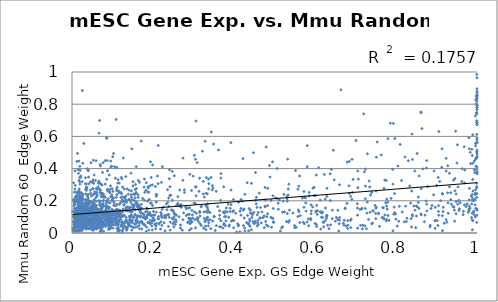
| Category | Series 0 |
|---|---|
| 0.718357 | 0.048 |
| 0.285556 | 0.115 |
| 0.155029 | 0.054 |
| 0.94191 | 0.328 |
| 0.474218 | 0.106 |
| 0.679518 | 0.44 |
| 0.994989 | 0.21 |
| 0.901487 | 0.076 |
| 0.110698 | 0.238 |
| 0.07789 | 0.042 |
| 0.333953 | 0.096 |
| 0.0120055 | 0.233 |
| 0.0165022 | 0.205 |
| 0.683924 | 0.293 |
| 0.888867 | 0.171 |
| 0.269317 | 0.176 |
| 0.150832 | 0.155 |
| 0.521332 | 0.199 |
| 0.196581 | 0.107 |
| 0.75157 | 0.159 |
| 0.637877 | 0.201 |
| 0.175998 | 0.095 |
| 0.660283 | 0.08 |
| 0.0950655 | 0.293 |
| 0.988347 | 0.24 |
| 0.483557 | 0.278 |
| 0.861981 | 0.118 |
| 0.060758 | 0.025 |
| 0.514572 | 0.012 |
| 0.0789242 | 0.058 |
| 0.996859 | 0.153 |
| 0.282066 | 0.151 |
| 0.999918 | 0.797 |
| 0.848596 | 0.033 |
| 0.0527951 | 0.152 |
| 0.337095 | 0.334 |
| 0.143686 | 0.104 |
| 0.144068 | 0.069 |
| 0.199073 | 0.423 |
| 0.549527 | 0.046 |
| 0.212938 | 0.544 |
| 0.572661 | 0.258 |
| 0.201103 | 0.134 |
| 0.313554 | 0.259 |
| 0.0573692 | 0.159 |
| 0.0279317 | 0.163 |
| 0.529778 | 0.071 |
| 0.517628 | 0.031 |
| 0.432492 | 0.312 |
| 0.0153344 | 0.092 |
| 0.625758 | 0.156 |
| 0.531065 | 0.212 |
| 0.0605387 | 0.112 |
| 0.443017 | 0.02 |
| 0.0858762 | 0.1 |
| 0.0252657 | 0.042 |
| 0.0222175 | 0.064 |
| 0.0837457 | 0.162 |
| 0.414497 | 0.008 |
| 0.423444 | 0.046 |
| 0.96833 | 0.536 |
| 0.0822502 | 0.304 |
| 0.09217 | 0.255 |
| 0.141815 | 0.155 |
| 0.234822 | 0.144 |
| 0.11498 | 0.261 |
| 0.141614 | 0.104 |
| 0.0581019 | 0.327 |
| 0.133703 | 0.161 |
| 0.0196944 | 0.038 |
| 0.0957484 | 0.447 |
| 0.0468442 | 0.085 |
| 0.0160687 | 0.041 |
| 0.0659149 | 0.059 |
| 0.181001 | 0.087 |
| 0.0706342 | 0.149 |
| 0.0345382 | 0.112 |
| 0.114906 | 0.055 |
| 0.155152 | 0.24 |
| 0.0438015 | 0.085 |
| 0.158073 | 0.246 |
| 0.0207399 | 0.071 |
| 0.109202 | 0.145 |
| 0.114537 | 0.064 |
| 0.0153444 | 0.142 |
| 0.117055 | 0.081 |
| 0.0210749 | 0.226 |
| 0.120328 | 0.189 |
| 0.343898 | 0.628 |
| 0.0160836 | 0.079 |
| 0.00742404 | 0.055 |
| 0.0233189 | 0.056 |
| 0.0383991 | 0.133 |
| 0.0199004 | 0.14 |
| 0.417271 | 0.152 |
| 0.232929 | 0.18 |
| 0.173498 | 0.059 |
| 0.0481266 | 0.065 |
| 0.116635 | 0.311 |
| 0.786092 | 0.681 |
| 0.0465272 | 0.152 |
| 0.27743 | 0.268 |
| 0.0352039 | 0.025 |
| 0.0249195 | 0.016 |
| 0.325787 | 0.13 |
| 0.951757 | 0.548 |
| 0.676875 | 0.044 |
| 0.0191285 | 0.344 |
| 0.0322849 | 0.055 |
| 0.289801 | 0.018 |
| 0.319936 | 0.167 |
| 0.0190005 | 0.095 |
| 0.236062 | 0.269 |
| 0.168207 | 0.128 |
| 0.0260575 | 0.025 |
| 0.6003 | 0.059 |
| 0.130739 | 0.215 |
| 0.314993 | 0.34 |
| 0.536633 | 0.077 |
| 0.568685 | 0.216 |
| 0.0700549 | 0.265 |
| 0.0309574 | 0.033 |
| 0.0722578 | 0.046 |
| 0.0693182 | 0.063 |
| 0.0136864 | 0.198 |
| 0.0696079 | 0.013 |
| 0.0482181 | 0.024 |
| 0.0118453 | 0.445 |
| 0.152051 | 0.163 |
| 0.167323 | 0.14 |
| 0.726782 | 0.027 |
| 0.0376793 | 0.173 |
| 0.0372241 | 0.044 |
| 0.493965 | 0.093 |
| 0.399084 | 0.033 |
| 0.145627 | 0.136 |
| 0.704594 | 0.182 |
| 0.840585 | 0.457 |
| 0.335006 | 0.148 |
| 0.0843456 | 0.084 |
| 0.604038 | 0.172 |
| 0.312608 | 0.07 |
| 0.0368721 | 0.054 |
| 0.681427 | 0.048 |
| 0.0508171 | 0.146 |
| 0.602584 | 0.137 |
| 0.0850064 | 0.133 |
| 0.705829 | 0.281 |
| 0.57118 | 0.067 |
| 0.808306 | 0.166 |
| 0.0705671 | 0.054 |
| 0.0232542 | 0.023 |
| 0.705768 | 0.385 |
| 0.597916 | 0.283 |
| 0.733568 | 0.323 |
| 0.53548 | 0.303 |
| 0.0891933 | 0.113 |
| 0.223292 | 0.098 |
| 0.580521 | 0.069 |
| 0.550494 | 0.033 |
| 0.0181383 | 0.191 |
| 0.315555 | 0.128 |
| 0.0463404 | 0.093 |
| 0.803249 | 0.043 |
| 0.0466587 | 0.071 |
| 0.364445 | 0.11 |
| 0.680432 | 0.028 |
| 0.116857 | 0.074 |
| 0.100539 | 0.125 |
| 0.128543 | 0.177 |
| 0.022665 | 0.103 |
| 0.012778 | 0.195 |
| 0.0418495 | 0.305 |
| 0.0871548 | 0.45 |
| 0.0176795 | 0.037 |
| 0.0101371 | 0.148 |
| 0.0856256 | 0.334 |
| 0.187494 | 0.113 |
| 0.0681547 | 0.099 |
| 0.0124649 | 0.114 |
| 0.969517 | 0.311 |
| 0.113535 | 0.11 |
| 0.0681806 | 0.699 |
| 0.178704 | 0.053 |
| 0.748192 | 0.172 |
| 0.0525424 | 0.031 |
| 0.0702964 | 0.416 |
| 0.422176 | 0.462 |
| 0.018036 | 0.099 |
| 0.0679802 | 0.131 |
| 0.101214 | 0.03 |
| 0.0896006 | 0.213 |
| 0.0225988 | 0.071 |
| 0.111407 | 0.101 |
| 0.0147012 | 0.065 |
| 0.0400479 | 0.39 |
| 0.0742723 | 0.062 |
| 0.0187522 | 0.064 |
| 0.139893 | 0.044 |
| 0.0211039 | 0.203 |
| 0.110488 | 0.069 |
| 0.094565 | 0.073 |
| 0.10492 | 0.081 |
| 0.0383495 | 0.147 |
| 0.0439104 | 0.105 |
| 0.0262996 | 0.091 |
| 0.0108756 | 0.194 |
| 0.105053 | 0.127 |
| 0.12918 | 0.11 |
| 0.0358865 | 0.043 |
| 0.033009 | 0.19 |
| 0.0545646 | 0.082 |
| 0.125645 | 0.108 |
| 0.0913621 | 0.032 |
| 0.197229 | 0.063 |
| 0.0856379 | 0.051 |
| 0.0629213 | 0.055 |
| 0.0462658 | 0.137 |
| 0.0591831 | 0.028 |
| 0.0870486 | 0.088 |
| 0.55784 | 0.102 |
| 0.198433 | 0.299 |
| 0.221934 | 0.047 |
| 0.120658 | 0.042 |
| 0.0503294 | 0.054 |
| 0.0932733 | 0.114 |
| 0.150976 | 0.161 |
| 0.166281 | 0.064 |
| 0.125929 | 0.039 |
| 0.161572 | 0.039 |
| 0.126058 | 0.024 |
| 0.0274446 | 0.117 |
| 0.0924494 | 0.125 |
| 0.411243 | 0.049 |
| 0.197301 | 0.043 |
| 0.439124 | 0.074 |
| 0.0700726 | 0.199 |
| 0.273901 | 0.327 |
| 0.30215 | 0.483 |
| 0.274168 | 0.465 |
| 0.166722 | 0.315 |
| 0.53701 | 0.142 |
| 0.923946 | 0.463 |
| 0.0377976 | 0.15 |
| 0.0284928 | 0.032 |
| 0.776772 | 0.167 |
| 0.174409 | 0.214 |
| 0.82044 | 0.069 |
| 0.0521454 | 0.056 |
| 0.167081 | 0.026 |
| 0.775905 | 0.075 |
| 0.113391 | 0.07 |
| 0.0213719 | 0.024 |
| 0.0993862 | 0.139 |
| 0.156346 | 0.144 |
| 0.999163 | 0.281 |
| 0.238074 | 0.041 |
| 0.398602 | 0.208 |
| 0.638395 | 0.051 |
| 0.825694 | 0.072 |
| 0.999379 | 0.066 |
| 0.670074 | 0.06 |
| 0.981042 | 0.166 |
| 0.480978 | 0.101 |
| 0.99989 | 0.766 |
| 0.43532 | 0.06 |
| 0.988663 | 0.218 |
| 0.193111 | 0.08 |
| 0.72301 | 0.044 |
| 0.855196 | 0.19 |
| 0.90352 | 0.047 |
| 0.756341 | 0.12 |
| 0.684908 | 0.246 |
| 0.973003 | 0.164 |
| 0.989307 | 0.333 |
| 0.585557 | 0.252 |
| 0.980014 | 0.149 |
| 0.038201 | 0.093 |
| 0.0584004 | 0.093 |
| 0.594336 | 0.162 |
| 0.133495 | 0.154 |
| 0.0330171 | 0.064 |
| 0.614403 | 0.129 |
| 0.138823 | 0.242 |
| 0.0905877 | 0.112 |
| 0.177713 | 0.104 |
| 0.857122 | 0.354 |
| 0.072196 | 0.239 |
| 0.330093 | 0.173 |
| 0.128755 | 0.194 |
| 0.0522356 | 0.049 |
| 0.0584545 | 0.249 |
| 0.457057 | 0.043 |
| 0.621135 | 0.065 |
| 0.124454 | 0.103 |
| 0.850452 | 0.105 |
| 0.18346 | 0.312 |
| 0.714606 | 0.148 |
| 0.137326 | 0.162 |
| 0.804975 | 0.416 |
| 0.506313 | 0.4 |
| 0.687748 | 0.079 |
| 0.574095 | 0.222 |
| 0.69102 | 0.209 |
| 0.309129 | 0.095 |
| 0.334107 | 0.243 |
| 0.0292313 | 0.151 |
| 0.111092 | 0.057 |
| 0.904274 | 0.345 |
| 0.292391 | 0.06 |
| 0.337602 | 0.064 |
| 0.272274 | 0.017 |
| 0.583426 | 0.088 |
| 0.71246 | 0.047 |
| 0.0591122 | 0.061 |
| 0.166717 | 0.162 |
| 0.962411 | 0.32 |
| 0.928381 | 0.187 |
| 0.425002 | 0.149 |
| 0.945716 | 0.262 |
| 0.142605 | 0.093 |
| 0.22847 | 0.108 |
| 0.0458777 | 0.194 |
| 0.297629 | 0.093 |
| 0.22016 | 0.109 |
| 0.98841 | 0.123 |
| 0.778189 | 0.148 |
| 0.387912 | 0.042 |
| 0.838799 | 0.261 |
| 0.390629 | 0.154 |
| 0.107161 | 0.11 |
| 0.242008 | 0.287 |
| 0.0221483 | 0.038 |
| 0.659693 | 0.057 |
| 0.190363 | 0.118 |
| 0.602073 | 0.13 |
| 0.337894 | 0.307 |
| 0.42534 | 0.093 |
| 0.165226 | 0.174 |
| 0.0149119 | 0.164 |
| 0.107183 | 0.062 |
| 0.336688 | 0.08 |
| 0.0666712 | 0.037 |
| 0.0319926 | 0.056 |
| 0.0930773 | 0.251 |
| 0.164657 | 0.146 |
| 0.0511316 | 0.086 |
| 0.0635012 | 0.057 |
| 0.019651 | 0.148 |
| 0.0574801 | 0.041 |
| 0.056643 | 0.077 |
| 0.0182736 | 0.106 |
| 0.426997 | 0.013 |
| 0.0480423 | 0.077 |
| 0.0317637 | 0.033 |
| 0.090616 | 0.152 |
| 0.874517 | 0.199 |
| 0.749595 | 0.122 |
| 0.152994 | 0.163 |
| 0.422767 | 0.142 |
| 0.109243 | 0.115 |
| 0.20055 | 0.09 |
| 0.124092 | 0.053 |
| 0.15244 | 0.099 |
| 0.390682 | 0.134 |
| 0.0553856 | 0.023 |
| 0.287095 | 0.155 |
| 0.148458 | 0.066 |
| 0.150987 | 0.094 |
| 0.0642308 | 0.085 |
| 0.0724478 | 0.023 |
| 0.0370698 | 0.163 |
| 0.0235357 | 0.056 |
| 0.0600038 | 0.084 |
| 0.0422625 | 0.188 |
| 0.00875941 | 0.09 |
| 0.0202835 | 0.187 |
| 0.0922949 | 0.076 |
| 0.0258915 | 0.073 |
| 0.0621678 | 0.103 |
| 0.0187486 | 0.319 |
| 0.0434104 | 0.068 |
| 0.0290432 | 0.556 |
| 0.0219038 | 0.065 |
| 0.0298475 | 0.098 |
| 0.0185486 | 0.097 |
| 0.0155305 | 0.095 |
| 0.00836883 | 0.096 |
| 0.178905 | 0.335 |
| 0.0350686 | 0.113 |
| 0.00313033 | 0.013 |
| 0.409005 | 0.057 |
| 0.99999 | 0.781 |
| 0.705156 | 0.03 |
| 0.642772 | 0.089 |
| 0.189449 | 0.116 |
| 0.948458 | 0.195 |
| 0.0229426 | 0.031 |
| 0.107544 | 0.142 |
| 0.496988 | 0.152 |
| 0.0654882 | 0.108 |
| 0.128297 | 0.057 |
| 1.0 | 0.492 |
| 0.113653 | 0.119 |
| 0.995609 | 0.099 |
| 0.0475176 | 0.071 |
| 1.0 | 0.506 |
| 0.172926 | 0.067 |
| 0.0987624 | 0.097 |
| 0.0193539 | 0.102 |
| 0.160225 | 0.1 |
| 0.0809594 | 0.103 |
| 0.004848 | 0.054 |
| 0.0260537 | 0.116 |
| 0.188661 | 0.066 |
| 0.0532216 | 0.308 |
| 0.00544776 | 0.128 |
| 0.065879 | 0.201 |
| 0.291099 | 0.364 |
| 0.00724447 | 0.196 |
| 0.0328903 | 0.106 |
| 0.013506 | 0.049 |
| 0.117464 | 0.016 |
| 0.024043 | 0.186 |
| 0.0251224 | 0.227 |
| 0.0160722 | 0.12 |
| 0.0923221 | 0.063 |
| 0.0330893 | 0.306 |
| 0.0235889 | 0.128 |
| 0.0373617 | 0.101 |
| 0.0226899 | 0.072 |
| 0.928856 | 0.123 |
| 0.0605936 | 0.171 |
| 0.0175206 | 0.15 |
| 0.100987 | 0.212 |
| 0.989866 | 0.076 |
| 0.117422 | 0.179 |
| 0.0776009 | 0.166 |
| 0.207924 | 0.228 |
| 0.492768 | 0.036 |
| 0.201311 | 0.08 |
| 0.0220259 | 0.354 |
| 0.15999 | 0.094 |
| 0.0371947 | 0.057 |
| 0.0548928 | 0.066 |
| 0.0299016 | 0.06 |
| 0.00728444 | 0.104 |
| 0.28061 | 0.161 |
| 0.10746 | 0.096 |
| 0.321984 | 0.508 |
| 0.0480868 | 0.156 |
| 0.163812 | 0.146 |
| 0.0691385 | 0.252 |
| 0.381183 | 0.156 |
| 0.168098 | 0.099 |
| 0.137462 | 0.059 |
| 0.15816 | 0.079 |
| 0.121029 | 0.134 |
| 0.0926403 | 0.072 |
| 0.0263363 | 0.238 |
| 0.0719615 | 0.302 |
| 0.108238 | 0.169 |
| 0.198015 | 0.074 |
| 0.111261 | 0.079 |
| 0.0616088 | 0.111 |
| 0.0337606 | 0.111 |
| 0.0279446 | 0.122 |
| 0.0318437 | 0.087 |
| 0.0184565 | 0.072 |
| 0.0164582 | 0.178 |
| 0.0118417 | 0.095 |
| 0.0699236 | 0.065 |
| 0.0675765 | 0.102 |
| 0.073409 | 0.144 |
| 0.0393377 | 0.171 |
| 0.0840835 | 0.186 |
| 0.0363018 | 0.078 |
| 0.0707856 | 0.12 |
| 0.0822908 | 0.14 |
| 0.041819 | 0.113 |
| 0.230094 | 0.095 |
| 0.0370766 | 0.132 |
| 0.0922987 | 0.122 |
| 0.035196 | 0.182 |
| 0.0373944 | 0.4 |
| 0.0368484 | 0.057 |
| 0.84401 | 0.168 |
| 0.0398237 | 0.149 |
| 0.968893 | 0.175 |
| 0.0921424 | 0.132 |
| 0.742144 | 0.061 |
| 0.996684 | 0.556 |
| 0.0546568 | 0.115 |
| 0.871583 | 0.111 |
| 0.157416 | 0.079 |
| 0.207528 | 0.043 |
| 0.0639192 | 0.12 |
| 0.252708 | 0.355 |
| 0.979956 | 0.591 |
| 0.855279 | 0.223 |
| 0.0570127 | 0.096 |
| 0.00614132 | 0.079 |
| 0.0956843 | 0.113 |
| 0.0189712 | 0.124 |
| 0.0120591 | 0.017 |
| 0.0452104 | 0.083 |
| 0.135016 | 0.017 |
| 0.121112 | 0.252 |
| 0.158357 | 0.252 |
| 0.153035 | 0.203 |
| 0.0337317 | 0.104 |
| 0.0230631 | 0.026 |
| 0.0618924 | 0.091 |
| 0.186018 | 0.149 |
| 0.00887429 | 0.117 |
| 0.0290007 | 0.088 |
| 0.074817 | 0.112 |
| 0.0402795 | 0.24 |
| 0.132847 | 0.35 |
| 0.206804 | 0.026 |
| 0.00645589 | 0.031 |
| 0.020534 | 0.091 |
| 0.0134809 | 0.494 |
| 0.0363262 | 0.072 |
| 0.0134591 | 0.253 |
| 0.0517626 | 0.316 |
| 0.0980891 | 0.113 |
| 0.0558845 | 0.256 |
| 0.0380486 | 0.159 |
| 0.177892 | 0.285 |
| 0.0175424 | 0.075 |
| 0.00980263 | 0.094 |
| 0.0236384 | 0.131 |
| 0.00397577 | 0.073 |
| 0.0061991 | 0.254 |
| 0.0088116 | 0.098 |
| 0.0106938 | 0.138 |
| 0.0336461 | 0.148 |
| 0.0384085 | 0.196 |
| 0.0110796 | 0.075 |
| 0.00576948 | 0.069 |
| 0.0611379 | 0.228 |
| 0.0506045 | 0.108 |
| 0.0719844 | 0.142 |
| 0.00523145 | 0.096 |
| 0.195928 | 0.186 |
| 0.0523021 | 0.164 |
| 0.0596102 | 0.029 |
| 0.0156793 | 0.192 |
| 0.277675 | 0.252 |
| 0.0288302 | 0.085 |
| 0.0270271 | 0.15 |
| 0.0978777 | 0.095 |
| 0.0683133 | 0.034 |
| 0.0459034 | 0.06 |
| 0.143415 | 0.134 |
| 0.0206203 | 0.057 |
| 0.0726655 | 0.054 |
| 0.040276 | 0.387 |
| 0.098396 | 0.148 |
| 0.367524 | 0.038 |
| 0.0108307 | 0.052 |
| 0.14672 | 0.262 |
| 0.036813 | 0.068 |
| 0.0747737 | 0.156 |
| 0.0196605 | 0.303 |
| 0.0236146 | 0.158 |
| 0.0179074 | 0.158 |
| 0.0399844 | 0.211 |
| 0.0804127 | 0.078 |
| 0.0656093 | 0.089 |
| 0.109357 | 0.063 |
| 0.0405566 | 0.132 |
| 0.0385126 | 0.184 |
| 0.054549 | 0.177 |
| 0.13465 | 0.19 |
| 0.124933 | 0.286 |
| 0.122376 | 0.243 |
| 0.43858 | 0.085 |
| 0.0901662 | 0.022 |
| 0.273947 | 0.082 |
| 0.701226 | 0.575 |
| 0.0623707 | 0.119 |
| 0.0131994 | 0.107 |
| 0.239013 | 0.166 |
| 0.0204833 | 0.115 |
| 0.105714 | 0.082 |
| 0.452602 | 0.073 |
| 0.836231 | 0.187 |
| 0.0226294 | 0.153 |
| 0.161074 | 0.078 |
| 0.305014 | 0.032 |
| 0.0387454 | 0.059 |
| 0.589547 | 0.083 |
| 0.379472 | 0.102 |
| 0.130212 | 0.043 |
| 0.737211 | 0.236 |
| 0.376612 | 0.101 |
| 0.185258 | 0.11 |
| 0.531661 | 0.121 |
| 0.141747 | 0.049 |
| 0.247636 | 0.382 |
| 0.0484678 | 0.164 |
| 0.0167652 | 0.13 |
| 0.00736248 | 0.107 |
| 0.0219418 | 0.224 |
| 0.0216522 | 0.346 |
| 0.107063 | 0.341 |
| 0.00753605 | 0.272 |
| 0.015198 | 0.393 |
| 0.0977996 | 0.051 |
| 0.0191938 | 0.09 |
| 0.0167608 | 0.139 |
| 0.0538776 | 0.241 |
| 0.0110527 | 0.067 |
| 0.0177158 | 0.082 |
| 0.0182761 | 0.104 |
| 0.0533476 | 0.12 |
| 0.0758922 | 0.065 |
| 0.0424399 | 0.115 |
| 0.0200409 | 0.168 |
| 0.0317875 | 0.085 |
| 0.0333483 | 0.343 |
| 0.00828313 | 0.295 |
| 0.0149492 | 0.109 |
| 0.0150583 | 0.053 |
| 0.173181 | 0.065 |
| 0.117179 | 0.112 |
| 0.0211326 | 0.145 |
| 0.0523996 | 0.056 |
| 0.0413371 | 0.028 |
| 0.0781463 | 0.203 |
| 0.0921525 | 0.063 |
| 0.0762764 | 0.133 |
| 0.255319 | 0.054 |
| 0.195667 | 0.109 |
| 0.0700316 | 0.133 |
| 0.0734983 | 0.152 |
| 0.443843 | 0.118 |
| 0.040067 | 0.219 |
| 0.0440704 | 0.091 |
| 0.417263 | 0.111 |
| 0.4396 | 0.042 |
| 0.0943499 | 0.091 |
| 0.0490169 | 0.063 |
| 0.242555 | 0.067 |
| 0.0724209 | 0.009 |
| 0.139368 | 0.061 |
| 0.0123547 | 0.061 |
| 0.0159963 | 0.37 |
| 0.0835936 | 0.111 |
| 0.435403 | 0.056 |
| 0.822004 | 0.472 |
| 0.0725491 | 0.089 |
| 0.00714861 | 0.176 |
| 0.625059 | 0.21 |
| 0.806792 | 0.073 |
| 0.0841138 | 0.079 |
| 0.772363 | 0.329 |
| 0.165706 | 0.047 |
| 0.0877426 | 0.082 |
| 0.729487 | 0.492 |
| 0.44319 | 0.308 |
| 0.605799 | 0.115 |
| 0.147382 | 0.018 |
| 0.290833 | 0.085 |
| 0.553632 | 0.036 |
| 0.0837369 | 0.137 |
| 0.999955 | 0.857 |
| 0.0767646 | 0.04 |
| 0.440966 | 0.141 |
| 0.383206 | 0.131 |
| 0.948501 | 0.242 |
| 0.8466 | 0.385 |
| 0.999392 | 0.985 |
| 0.351285 | 0.102 |
| 0.508885 | 0.184 |
| 0.656414 | 0.084 |
| 0.113751 | 0.331 |
| 0.0608416 | 0.074 |
| 0.102566 | 0.494 |
| 0.437339 | 0.151 |
| 0.0907006 | 0.128 |
| 0.0821823 | 0.221 |
| 0.981312 | 0.277 |
| 0.275646 | 0.125 |
| 0.87004 | 0.07 |
| 0.229894 | 0.095 |
| 0.459959 | 0.128 |
| 0.0394409 | 0.237 |
| 0.603695 | 0.052 |
| 0.585559 | 0.231 |
| 0.672236 | 0.079 |
| 0.852296 | 0.163 |
| 0.460079 | 0.053 |
| 0.308929 | 0.437 |
| 0.240093 | 0.097 |
| 0.791708 | 0.395 |
| 0.304714 | 0.286 |
| 0.0478347 | 0.081 |
| 0.0251958 | 0.12 |
| 0.0818194 | 0.168 |
| 0.0384946 | 0.156 |
| 0.0693534 | 0.308 |
| 0.186378 | 0.199 |
| 0.254967 | 0.113 |
| 0.161708 | 0.162 |
| 0.122709 | 0.052 |
| 0.0944957 | 0.028 |
| 0.145881 | 0.237 |
| 0.14868 | 0.078 |
| 0.267972 | 0.05 |
| 0.020729 | 0.076 |
| 0.111615 | 0.177 |
| 0.0359935 | 0.092 |
| 0.410549 | 0.044 |
| 0.155855 | 0.115 |
| 0.0910851 | 0.033 |
| 0.0723583 | 0.068 |
| 0.184662 | 0.155 |
| 0.0500671 | 0.04 |
| 0.0155442 | 0.178 |
| 0.00568655 | 0.019 |
| 0.0166314 | 0.165 |
| 0.0516844 | 0.276 |
| 0.140459 | 0.058 |
| 0.0900105 | 0.068 |
| 0.00886976 | 0.064 |
| 0.0305544 | 0.057 |
| 0.0997282 | 0.053 |
| 0.0255035 | 0.131 |
| 0.0947624 | 0.035 |
| 0.00941241 | 0.015 |
| 0.0484357 | 0.046 |
| 0.0515653 | 0.044 |
| 0.0720706 | 0.072 |
| 0.208628 | 0.059 |
| 0.0596119 | 0.276 |
| 0.0715147 | 0.115 |
| 0.0456764 | 0.145 |
| 0.0439256 | 0.151 |
| 0.181646 | 0.132 |
| 0.220823 | 0.314 |
| 0.0545085 | 0.15 |
| 0.00584269 | 0.153 |
| 0.34673 | 0.295 |
| 0.0432411 | 0.052 |
| 0.113214 | 0.051 |
| 0.301329 | 0.186 |
| 0.136589 | 0.028 |
| 0.240849 | 0.393 |
| 0.0207201 | 0.157 |
| 0.629493 | 0.278 |
| 0.577044 | 0.188 |
| 0.0305111 | 0.184 |
| 0.0317294 | 0.158 |
| 0.112504 | 0.105 |
| 0.0556786 | 0.181 |
| 0.0486552 | 0.173 |
| 0.285633 | 0.065 |
| 0.0605524 | 0.067 |
| 0.0866792 | 0.118 |
| 0.0412431 | 0.082 |
| 0.0292048 | 0.134 |
| 0.0134387 | 0.125 |
| 0.0895584 | 0.102 |
| 0.0186224 | 0.07 |
| 0.0185678 | 0.075 |
| 0.087383 | 0.058 |
| 0.07681 | 0.197 |
| 0.474791 | 0.033 |
| 0.0558652 | 0.057 |
| 0.348027 | 0.28 |
| 0.0655093 | 0.312 |
| 0.0109048 | 0.059 |
| 0.0610517 | 0.152 |
| 0.0175284 | 0.083 |
| 0.015022 | 0.073 |
| 0.123338 | 0.336 |
| 0.0321199 | 0.168 |
| 0.840136 | 0.114 |
| 0.0372231 | 0.121 |
| 0.297295 | 0.113 |
| 0.985498 | 0.23 |
| 0.0492996 | 0.082 |
| 0.0326106 | 0.181 |
| 0.0122548 | 0.121 |
| 0.753479 | 0.565 |
| 0.347228 | 0.074 |
| 0.0346089 | 0.11 |
| 0.0194673 | 0.127 |
| 0.0606466 | 0.046 |
| 0.0914727 | 0.122 |
| 0.361753 | 0.516 |
| 0.478232 | 0.071 |
| 0.2478 | 0.204 |
| 0.0602337 | 0.149 |
| 0.0267909 | 0.075 |
| 0.0524157 | 0.152 |
| 0.0201024 | 0.158 |
| 0.0663278 | 0.082 |
| 0.00776094 | 0.145 |
| 0.724239 | 0.153 |
| 0.0417037 | 0.194 |
| 0.102068 | 0.072 |
| 0.0210884 | 0.028 |
| 0.0424755 | 0.081 |
| 0.00957614 | 0.079 |
| 0.0176703 | 0.249 |
| 0.0255462 | 0.076 |
| 0.00970217 | 0.149 |
| 0.0073169 | 0.19 |
| 0.623191 | 0.364 |
| 0.0363983 | 0.026 |
| 0.0200321 | 0.389 |
| 0.995012 | 0.175 |
| 0.0187567 | 0.063 |
| 0.246008 | 0.144 |
| 0.086547 | 0.104 |
| 0.0316116 | 0.077 |
| 0.0723215 | 0.058 |
| 0.0442414 | 0.072 |
| 0.0354523 | 0.305 |
| 0.0629371 | 0.113 |
| 0.0243246 | 0.164 |
| 0.316341 | 0.058 |
| 0.396743 | 0.079 |
| 0.110369 | 0.104 |
| 0.0958865 | 0.078 |
| 0.0228428 | 0.198 |
| 0.0170522 | 0.045 |
| 0.0490781 | 0.161 |
| 0.0176951 | 0.024 |
| 0.0546475 | 0.36 |
| 0.0505459 | 0.275 |
| 0.00952457 | 0.116 |
| 0.0621785 | 0.072 |
| 0.115575 | 0.099 |
| 0.0306851 | 0.136 |
| 0.0123689 | 0.121 |
| 0.0494578 | 0.063 |
| 0.0100556 | 0.079 |
| 0.0592591 | 0.152 |
| 0.0802994 | 0.06 |
| 0.178592 | 0.05 |
| 0.0381937 | 0.15 |
| 0.0169559 | 0.446 |
| 0.497843 | 0.066 |
| 0.0706778 | 0.009 |
| 0.0369754 | 0.278 |
| 0.192889 | 0.059 |
| 0.0497123 | 0.162 |
| 0.0190018 | 0.045 |
| 0.0650779 | 0.144 |
| 0.0745529 | 0.071 |
| 0.0678404 | 0.069 |
| 0.0426986 | 0.066 |
| 0.0562791 | 0.151 |
| 0.336258 | 0.137 |
| 0.0485622 | 0.051 |
| 0.0340362 | 0.097 |
| 0.00972595 | 0.208 |
| 0.00354324 | 0.104 |
| 0.0270753 | 0.051 |
| 0.0294105 | 0.067 |
| 0.0194276 | 0.414 |
| 0.016204 | 0.259 |
| 0.0306093 | 0.149 |
| 0.0129704 | 0.208 |
| 0.100966 | 0.258 |
| 0.0683276 | 0.098 |
| 0.0879076 | 0.079 |
| 0.016067 | 0.107 |
| 0.0268585 | 0.238 |
| 0.00147405 | 0.134 |
| 0.144769 | 0.043 |
| 0.0944452 | 0.131 |
| 0.330856 | 0.021 |
| 0.0346889 | 0.062 |
| 0.11567 | 0.022 |
| 0.0731342 | 0.027 |
| 0.0940381 | 0.186 |
| 0.0267364 | 0.033 |
| 0.0364985 | 0.127 |
| 0.030402 | 0.082 |
| 0.029441 | 0.077 |
| 0.0886164 | 0.074 |
| 0.00786048 | 0.017 |
| 0.00217416 | 0.029 |
| 0.24227 | 0.018 |
| 0.0641771 | 0.104 |
| 0.0923118 | 0.049 |
| 0.364328 | 0.088 |
| 0.204937 | 0.056 |
| 0.603308 | 0.36 |
| 0.999436 | 0.222 |
| 0.231283 | 0.107 |
| 0.797006 | 0.126 |
| 0.694094 | 0.333 |
| 0.170954 | 0.571 |
| 0.0107525 | 0.138 |
| 0.0340786 | 0.164 |
| 0.309761 | 0.086 |
| 0.0937169 | 0.079 |
| 0.763524 | 0.485 |
| 0.0795027 | 0.108 |
| 0.952481 | 0.179 |
| 0.774771 | 0.188 |
| 0.00997594 | 0.064 |
| 0.123997 | 0.014 |
| 0.263982 | 0.101 |
| 0.0425504 | 0.18 |
| 0.905923 | 0.63 |
| 0.0667607 | 0.62 |
| 0.465685 | 0.158 |
| 0.459165 | 0.079 |
| 0.671437 | 0.049 |
| 0.155803 | 0.218 |
| 0.353658 | 0.016 |
| 0.993395 | 0.207 |
| 0.875916 | 0.179 |
| 0.214836 | 0.055 |
| 0.875838 | 0.45 |
| 0.150997 | 0.319 |
| 0.656487 | 0.141 |
| 0.336633 | 0.045 |
| 0.121668 | 0.103 |
| 0.110263 | 0.113 |
| 0.218619 | 0.024 |
| 0.93506 | 0.208 |
| 0.229851 | 0.013 |
| 0.739675 | 0.252 |
| 0.932044 | 0.37 |
| 0.50186 | 0.218 |
| 0.0525716 | 0.039 |
| 0.796977 | 0.587 |
| 0.927377 | 0.249 |
| 0.487722 | 0.419 |
| 0.00382168 | 0.311 |
| 0.0379425 | 0.037 |
| 0.00981975 | 0.193 |
| 0.0332461 | 0.075 |
| 0.164795 | 0.164 |
| 0.22724 | 0.063 |
| 0.266345 | 0.166 |
| 0.0244053 | 0.044 |
| 0.0134623 | 0.122 |
| 0.0145611 | 0.025 |
| 0.0516699 | 0.016 |
| 0.191883 | 0.12 |
| 0.509616 | 0.147 |
| 0.0549682 | 0.106 |
| 0.0151642 | 0.11 |
| 0.146373 | 0.111 |
| 0.172084 | 0.153 |
| 0.00530284 | 0.058 |
| 0.270102 | 0.16 |
| 0.0876315 | 0.263 |
| 0.0373635 | 0.093 |
| 0.00675225 | 0.092 |
| 0.0169715 | 0.106 |
| 0.00307214 | 0.069 |
| 0.36436 | 0.138 |
| 0.823834 | 0.167 |
| 0.0130872 | 0.158 |
| 0.179977 | 0.094 |
| 0.0163829 | 0.119 |
| 0.0514596 | 0.103 |
| 0.00805303 | 0.034 |
| 0.0876541 | 0.068 |
| 0.0879437 | 0.054 |
| 0.0473121 | 0.196 |
| 0.0184987 | 0.074 |
| 0.0234395 | 0.15 |
| 0.0916758 | 0.114 |
| 0.068776 | 0.068 |
| 0.0269063 | 0.205 |
| 0.0695563 | 0.425 |
| 0.0227607 | 0.078 |
| 0.102642 | 0.11 |
| 0.0306235 | 0.105 |
| 0.00573101 | 0.186 |
| 0.0222389 | 0.186 |
| 0.0384934 | 0.139 |
| 0.014725 | 0.018 |
| 0.0252397 | 0.319 |
| 0.163496 | 0.221 |
| 0.0887462 | 0.194 |
| 0.0771687 | 0.046 |
| 0.220662 | 0.118 |
| 0.944123 | 0.142 |
| 0.266201 | 0.267 |
| 0.999999 | 0.368 |
| 0.200199 | 0.094 |
| 0.12901 | 0.106 |
| 0.33488 | 0.098 |
| 0.380141 | 0.075 |
| 0.23154 | 0.097 |
| 0.523461 | 0.24 |
| 0.12113 | 0.221 |
| 0.294924 | 0.071 |
| 0.0788621 | 0.105 |
| 1.0 | 0.88 |
| 0.6881 | 0.228 |
| 0.7688 | 0.095 |
| 0.146905 | 0.222 |
| 0.965792 | 0.114 |
| 0.999938 | 0.244 |
| 0.0493127 | 0.071 |
| 0.0474831 | 0.23 |
| 0.916595 | 0.16 |
| 0.999974 | 0.395 |
| 0.0265708 | 0.433 |
| 0.0680738 | 0.174 |
| 0.0147596 | 0.051 |
| 0.0319983 | 0.042 |
| 0.0103029 | 0.068 |
| 0.0300168 | 0.094 |
| 0.0981144 | 0.202 |
| 0.0550307 | 0.151 |
| 0.0430773 | 0.124 |
| 0.158263 | 0.057 |
| 0.13044 | 0.064 |
| 0.0964236 | 0.088 |
| 0.0213294 | 0.072 |
| 0.0283656 | 0.077 |
| 0.0930599 | 0.087 |
| 0.0367 | 0.074 |
| 0.0295823 | 0.066 |
| 0.14529 | 0.19 |
| 0.123173 | 0.042 |
| 0.109269 | 0.221 |
| 0.205991 | 0.288 |
| 0.866384 | 0.398 |
| 0.0213966 | 0.129 |
| 0.0194272 | 0.012 |
| 0.0419639 | 0.063 |
| 0.373272 | 0.13 |
| 0.0266915 | 0.212 |
| 0.077746 | 0.011 |
| 0.190044 | 0.065 |
| 0.0261322 | 0.107 |
| 0.815375 | 0.131 |
| 0.00331565 | 0.101 |
| 0.0843224 | 0.138 |
| 0.251904 | 0.099 |
| 0.449038 | 0.129 |
| 0.0693692 | 0.125 |
| 0.169699 | 0.108 |
| 0.177354 | 0.115 |
| 0.0330175 | 0.07 |
| 0.189418 | 0.019 |
| 0.419877 | 0.198 |
| 0.770514 | 0.278 |
| 0.560215 | 0.132 |
| 0.562053 | 0.354 |
| 0.980589 | 0.206 |
| 0.0963983 | 0.224 |
| 0.158036 | 0.194 |
| 0.13428 | 0.082 |
| 0.214256 | 0.087 |
| 0.103545 | 0.125 |
| 0.0450109 | 0.027 |
| 0.0419051 | 0.065 |
| 0.0336009 | 0.243 |
| 0.0496819 | 0.318 |
| 0.0300428 | 0.064 |
| 0.0164161 | 0.074 |
| 0.0884677 | 0.159 |
| 0.359596 | 0.164 |
| 0.0292047 | 0.034 |
| 0.0836177 | 0.132 |
| 0.779936 | 0.586 |
| 0.0486095 | 0.043 |
| 0.00764136 | 0.091 |
| 0.0214587 | 0.17 |
| 0.0156282 | 0.247 |
| 0.133659 | 0.137 |
| 0.0111115 | 0.072 |
| 0.19881 | 0.171 |
| 0.0237001 | 0.25 |
| 0.0315813 | 0.152 |
| 0.0547503 | 0.142 |
| 0.0191619 | 0.104 |
| 0.0113247 | 0.047 |
| 0.063166 | 0.138 |
| 0.0172965 | 0.055 |
| 0.0988252 | 0.276 |
| 0.0239343 | 0.209 |
| 0.124235 | 0.206 |
| 0.0190594 | 0.213 |
| 0.0397676 | 0.136 |
| 0.15764 | 0.184 |
| 0.0856734 | 0.201 |
| 0.144308 | 0.082 |
| 0.86416 | 0.649 |
| 0.47661 | 0.283 |
| 0.856778 | 0.153 |
| 0.613446 | 0.132 |
| 0.606406 | 0.138 |
| 0.614128 | 0.024 |
| 0.0305391 | 0.055 |
| 0.993298 | 0.446 |
| 0.896564 | 0.029 |
| 0.467444 | 0.062 |
| 0.311637 | 0.094 |
| 0.00929028 | 0.036 |
| 0.913798 | 0.523 |
| 0.840641 | 0.106 |
| 0.326563 | 0.091 |
| 0.839545 | 0.615 |
| 0.238809 | 0.115 |
| 0.323921 | 0.243 |
| 0.282134 | 0.108 |
| 0.120966 | 0.119 |
| 0.945661 | 0.338 |
| 0.0621405 | 0.27 |
| 0.663962 | 0.889 |
| 0.0214052 | 0.167 |
| 0.202946 | 0.078 |
| 0.105984 | 0.106 |
| 0.115151 | 0.13 |
| 0.609106 | 0.406 |
| 0.707182 | 0.335 |
| 0.45338 | 0.203 |
| 0.8762 | 0.137 |
| 0.830588 | 0.449 |
| 0.897254 | 0.079 |
| 0.106284 | 0.091 |
| 0.743749 | 0.137 |
| 0.735226 | 0.286 |
| 0.219662 | 0.069 |
| 0.83386 | 0.292 |
| 0.894073 | 0.385 |
| 0.999999 | 0.778 |
| 0.128019 | 0.173 |
| 0.928007 | 0.417 |
| 0.980375 | 0.139 |
| 0.0820368 | 0.45 |
| 0.00543248 | 0.041 |
| 0.0664612 | 0.323 |
| 0.0327641 | 0.05 |
| 0.136793 | 0.038 |
| 0.914361 | 0.245 |
| 0.0461203 | 0.128 |
| 0.886429 | 0.152 |
| 0.625318 | 0.077 |
| 0.012294 | 0.061 |
| 0.0640753 | 0.056 |
| 0.0610093 | 0.057 |
| 0.00841893 | 0.137 |
| 0.955162 | 0.203 |
| 0.0281276 | 0.127 |
| 0.742955 | 0.138 |
| 0.904872 | 0.17 |
| 0.296385 | 0.069 |
| 0.315288 | 0.134 |
| 0.376317 | 0.124 |
| 0.999433 | 0.612 |
| 0.688302 | 0.033 |
| 0.133359 | 0.204 |
| 0.862333 | 0.275 |
| 0.323949 | 0.32 |
| 0.573813 | 0.058 |
| 0.0959639 | 0.409 |
| 0.787802 | 0.215 |
| 0.0990582 | 0.225 |
| 0.399482 | 0.077 |
| 0.999498 | 0.502 |
| 0.398909 | 0.138 |
| 0.724347 | 0.397 |
| 0.991882 | 0.201 |
| 0.905617 | 0.11 |
| 0.126406 | 0.149 |
| 0.69271 | 0.252 |
| 0.488953 | 0.348 |
| 0.892766 | 0.237 |
| 0.999896 | 0.11 |
| 0.261371 | 0.226 |
| 0.999394 | 0.287 |
| 0.932079 | 0.287 |
| 0.261389 | 0.184 |
| 0.113387 | 0.31 |
| 0.850412 | 0.167 |
| 0.612798 | 0.204 |
| 0.303218 | 0.083 |
| 0.465089 | 0.094 |
| 0.0183128 | 0.122 |
| 0.480244 | 0.05 |
| 0.101868 | 0.051 |
| 0.222723 | 0.147 |
| 0.101898 | 0.088 |
| 0.0334851 | 0.126 |
| 0.174602 | 0.121 |
| 0.125286 | 0.224 |
| 0.74007 | 0.057 |
| 0.71105 | 0.147 |
| 0.0937444 | 0.27 |
| 0.426847 | 0.24 |
| 0.0493229 | 0.159 |
| 0.0518858 | 0.33 |
| 0.37502 | 0.052 |
| 0.0757783 | 0.103 |
| 0.172511 | 0.025 |
| 0.0371887 | 0.175 |
| 0.306511 | 0.287 |
| 0.134004 | 0.097 |
| 0.115268 | 0.126 |
| 0.0300962 | 0.121 |
| 0.208149 | 0.192 |
| 0.326907 | 0.223 |
| 0.13611 | 0.274 |
| 0.852117 | 0.494 |
| 0.187548 | 0.255 |
| 0.042193 | 0.117 |
| 0.045341 | 0.266 |
| 0.0588306 | 0.246 |
| 0.0684659 | 0.272 |
| 0.318845 | 0.162 |
| 0.629328 | 0.227 |
| 0.617644 | 0.124 |
| 0.0178212 | 0.127 |
| 0.0128493 | 0.1 |
| 0.087372 | 0.13 |
| 0.66098 | 0.097 |
| 0.476854 | 0.162 |
| 0.111461 | 0.285 |
| 0.0132372 | 0.016 |
| 0.148941 | 0.037 |
| 0.0354304 | 0.153 |
| 0.342623 | 0.027 |
| 0.0128216 | 0.133 |
| 0.457375 | 0.112 |
| 0.161417 | 0.106 |
| 0.0826615 | 0.09 |
| 0.011322 | 0.041 |
| 0.16321 | 0.238 |
| 0.331101 | 0.079 |
| 0.0741868 | 0.298 |
| 0.109064 | 0.705 |
| 0.0347318 | 0.114 |
| 0.750234 | 0.154 |
| 0.392614 | 0.176 |
| 0.0568967 | 0.116 |
| 0.333922 | 0.161 |
| 0.0177221 | 0.026 |
| 0.0308496 | 0.075 |
| 0.0176777 | 0.171 |
| 0.584541 | 0.045 |
| 0.0106893 | 0.136 |
| 0.0106593 | 0.117 |
| 0.120431 | 0.086 |
| 0.00956204 | 0.093 |
| 0.0326307 | 0.09 |
| 0.590342 | 0.175 |
| 0.0296961 | 0.115 |
| 0.471712 | 0.095 |
| 0.0177697 | 0.274 |
| 0.0339905 | 0.14 |
| 0.0145105 | 0.104 |
| 0.0174702 | 0.175 |
| 0.0276852 | 0.17 |
| 0.187676 | 0.287 |
| 0.0360591 | 0.073 |
| 0.267752 | 0.031 |
| 0.0766776 | 0.096 |
| 0.0133525 | 0.076 |
| 0.00922388 | 0.009 |
| 0.0354702 | 0.115 |
| 0.0148727 | 0.176 |
| 0.00953768 | 0.228 |
| 0.060122 | 0.075 |
| 0.0807598 | 0.051 |
| 0.01266 | 0.078 |
| 0.0260722 | 0.085 |
| 0.10318 | 0.171 |
| 0.48309 | 0.119 |
| 0.00899029 | 0.074 |
| 0.0611975 | 0.117 |
| 0.304891 | 0.182 |
| 0.131634 | 0.197 |
| 0.776932 | 0.084 |
| 0.645109 | 0.514 |
| 0.0197087 | 0.216 |
| 0.0601595 | 0.072 |
| 0.0495112 | 0.139 |
| 0.0355436 | 0.088 |
| 0.0102292 | 0.07 |
| 0.186993 | 0.065 |
| 0.0793295 | 0.23 |
| 0.0937992 | 0.025 |
| 0.476559 | 0.167 |
| 0.0769042 | 0.18 |
| 0.0371454 | 0.064 |
| 0.021696 | 0.091 |
| 0.0312612 | 0.121 |
| 0.030651 | 0.124 |
| 0.58082 | 0.543 |
| 0.794325 | 0.117 |
| 0.0609468 | 0.042 |
| 0.0198247 | 0.029 |
| 0.189591 | 0.253 |
| 0.0209704 | 0.082 |
| 0.0124501 | 0.125 |
| 0.647504 | 0.33 |
| 0.71684 | 0.026 |
| 0.0270547 | 0.137 |
| 0.050304 | 0.068 |
| 0.925684 | 0.067 |
| 0.0502598 | 0.118 |
| 0.0745005 | 0.069 |
| 0.0923093 | 0.047 |
| 0.0599881 | 0.112 |
| 0.0149945 | 0.064 |
| 0.0189023 | 0.164 |
| 0.107643 | 0.094 |
| 0.171021 | 0.073 |
| 0.0627046 | 0.054 |
| 0.011899 | 0.043 |
| 0.0127041 | 0.071 |
| 0.0175212 | 0.134 |
| 0.00436368 | 0.209 |
| 0.131472 | 0.073 |
| 0.590912 | 0.137 |
| 0.14706 | 0.129 |
| 0.0752364 | 0.376 |
| 0.140068 | 0.208 |
| 0.0339301 | 0.094 |
| 0.750055 | 0.089 |
| 0.113925 | 0.009 |
| 0.0626181 | 0.236 |
| 0.142259 | 0.081 |
| 0.330517 | 0.084 |
| 0.0707448 | 0.034 |
| 0.069872 | 0.264 |
| 0.999874 | 0.686 |
| 0.94305 | 0.16 |
| 0.792459 | 0.304 |
| 0.225855 | 0.161 |
| 0.0192566 | 0.077 |
| 0.705091 | 0.111 |
| 0.496016 | 0.091 |
| 0.969853 | 0.391 |
| 0.994723 | 0.375 |
| 0.148928 | 0.176 |
| 0.134827 | 0.201 |
| 0.0311238 | 0.033 |
| 0.156021 | 0.271 |
| 0.304738 | 0.458 |
| 0.023822 | 0.074 |
| 0.184629 | 0.101 |
| 0.0463647 | 0.078 |
| 0.125411 | 0.132 |
| 0.396986 | 0.133 |
| 0.947389 | 0.632 |
| 0.306386 | 0.231 |
| 0.0381394 | 0.156 |
| 0.100273 | 0.13 |
| 0.257386 | 0.112 |
| 0.557742 | 0.272 |
| 0.0600798 | 0.093 |
| 0.631078 | 0.048 |
| 0.732095 | 0.084 |
| 0.995502 | 0.237 |
| 0.768707 | 0.156 |
| 0.0513378 | 0.094 |
| 0.0229951 | 0.216 |
| 0.720276 | 0.74 |
| 0.291509 | 0.091 |
| 0.169223 | 0.13 |
| 0.0375097 | 0.124 |
| 0.7773 | 0.211 |
| 0.770345 | 0.087 |
| 0.0772222 | 0.243 |
| 0.0309198 | 0.096 |
| 0.073915 | 0.174 |
| 0.0891644 | 0.062 |
| 0.915245 | 0.242 |
| 0.0672661 | 0.085 |
| 0.799702 | 0.086 |
| 0.999999 | 0.87 |
| 0.291412 | 0.058 |
| 0.153109 | 0.175 |
| 0.150487 | 0.293 |
| 0.0530479 | 0.097 |
| 0.158464 | 0.07 |
| 0.0505772 | 0.134 |
| 0.780244 | 0.109 |
| 0.0111953 | 0.251 |
| 0.0266972 | 0.178 |
| 0.0397381 | 0.151 |
| 0.0558205 | 0.166 |
| 0.0449069 | 0.095 |
| 0.00327585 | 0.105 |
| 0.99352 | 0.392 |
| 0.386951 | 0.097 |
| 0.0504786 | 0.235 |
| 0.013127 | 0.106 |
| 0.152469 | 0.033 |
| 0.445851 | 0.115 |
| 0.293795 | 0.081 |
| 0.0440966 | 0.087 |
| 0.37281 | 0.03 |
| 0.956411 | 0.15 |
| 0.149703 | 0.064 |
| 0.163472 | 0.107 |
| 0.132705 | 0.029 |
| 0.837204 | 0.09 |
| 0.604178 | 0.04 |
| 0.114278 | 0.019 |
| 0.257174 | 0.071 |
| 0.160117 | 0.17 |
| 0.00844793 | 0.076 |
| 0.184488 | 0.097 |
| 0.00692626 | 0.028 |
| 0.158621 | 0.412 |
| 0.356338 | 0.046 |
| 0.826926 | 0.092 |
| 0.909929 | 0.201 |
| 0.0131028 | 0.084 |
| 0.019916 | 0.038 |
| 0.0423067 | 0.032 |
| 0.00962776 | 0.092 |
| 0.0243319 | 0.139 |
| 0.00920107 | 0.094 |
| 0.0412011 | 0.067 |
| 0.133205 | 0.23 |
| 0.0386686 | 0.076 |
| 0.100188 | 0.051 |
| 0.0255645 | 0.885 |
| 0.0401591 | 0.054 |
| 0.074973 | 0.089 |
| 0.085278 | 0.125 |
| 0.0434472 | 0.049 |
| 0.18337 | 0.01 |
| 0.779356 | 0.191 |
| 0.0465833 | 0.086 |
| 0.562379 | 0.065 |
| 0.204242 | 0.111 |
| 0.296046 | 0.14 |
| 0.914552 | 0.014 |
| 0.113171 | 0.011 |
| 0.0342605 | 0.041 |
| 0.936721 | 0.18 |
| 0.519992 | 0.129 |
| 0.955684 | 0.14 |
| 0.449135 | 0.059 |
| 0.589267 | 0.09 |
| 0.980662 | 0.523 |
| 0.329727 | 0.043 |
| 0.258015 | 0.172 |
| 0.999995 | 0.56 |
| 0.200431 | 0.111 |
| 0.0351075 | 0.28 |
| 0.059905 | 0.098 |
| 0.87513 | 0.404 |
| 1.0 | 0.821 |
| 0.78256 | 0.078 |
| 0.999992 | 0.38 |
| 0.368086 | 0.075 |
| 0.724714 | 0.292 |
| 0.0259443 | 0.056 |
| 0.684818 | 0.445 |
| 0.992153 | 0.137 |
| 0.907847 | 0.32 |
| 0.999964 | 0.142 |
| 0.999998 | 0.672 |
| 0.883781 | 0.038 |
| 0.989276 | 0.61 |
| 0.999992 | 0.685 |
| 0.99099 | 0.127 |
| 0.993432 | 0.112 |
| 0.940785 | 0.165 |
| 0.436536 | 0.054 |
| 0.847027 | 0.142 |
| 0.999458 | 0.844 |
| 1.0 | 0.834 |
| 0.983253 | 0.501 |
| 0.534634 | 0.067 |
| 0.999467 | 0.74 |
| 0.414872 | 0.136 |
| 0.990203 | 0.261 |
| 0.999978 | 0.791 |
| 0.996348 | 0.457 |
| 0.776088 | 0.326 |
| 0.916355 | 0.133 |
| 0.759168 | 0.042 |
| 0.997301 | 0.465 |
| 0.999431 | 0.855 |
| 0.98449 | 0.432 |
| 0.914533 | 0.107 |
| 0.966601 | 0.135 |
| 0.98859 | 0.02 |
| 0.999979 | 0.579 |
| 1.0 | 0.467 |
| 0.650394 | 0.073 |
| 1.0 | 0.964 |
| 0.0393145 | 0.199 |
| 0.551951 | 0.388 |
| 0.0243744 | 0.109 |
| 0.0739171 | 0.247 |
| 0.117004 | 0.122 |
| 0.628473 | 0.105 |
| 0.999987 | 0.476 |
| 0.861995 | 0.113 |
| 0.0023692 | 0.028 |
| 0.0968999 | 0.076 |
| 0.704827 | 0.155 |
| 0.21904 | 0.128 |
| 0.124248 | 0.071 |
| 0.0574916 | 0.131 |
| 0.17948 | 0.05 |
| 0.0413368 | 0.08 |
| 0.238686 | 0.216 |
| 0.318994 | 0.047 |
| 0.463719 | 0.093 |
| 0.190822 | 0.209 |
| 0.045879 | 0.073 |
| 0.55894 | 0.143 |
| 0.213496 | 0.102 |
| 0.0530609 | 0.081 |
| 0.86155 | 0.751 |
| 0.0654796 | 0.048 |
| 0.102895 | 0.194 |
| 0.0278697 | 0.128 |
| 0.247036 | 0.091 |
| 0.62971 | 0.109 |
| 0.689407 | 0.085 |
| 0.0193748 | 0.125 |
| 0.0741737 | 0.247 |
| 0.0245428 | 0.039 |
| 0.00882137 | 0.057 |
| 0.404453 | 0.123 |
| 0.0548421 | 0.206 |
| 0.100479 | 0.474 |
| 0.0197263 | 0.083 |
| 0.077435 | 0.222 |
| 0.0947477 | 0.122 |
| 0.0394882 | 0.201 |
| 0.241556 | 0.232 |
| 0.0803702 | 0.122 |
| 0.184216 | 0.09 |
| 0.0684888 | 0.122 |
| 0.0220403 | 0.07 |
| 0.10763 | 0.048 |
| 0.0520687 | 0.172 |
| 0.0260133 | 0.132 |
| 0.0563346 | 0.089 |
| 0.0622426 | 0.131 |
| 0.0940921 | 0.11 |
| 0.141664 | 0.159 |
| 0.13418 | 0.031 |
| 0.0864496 | 0.59 |
| 0.328167 | 0.071 |
| 0.0765586 | 0.234 |
| 0.60153 | 0.232 |
| 0.0137602 | 0.062 |
| 0.678913 | 0.184 |
| 0.12876 | 0.274 |
| 0.3374 | 0.274 |
| 0.162699 | 0.171 |
| 0.0980294 | 0.236 |
| 0.203304 | 0.082 |
| 0.0851326 | 0.075 |
| 0.0200464 | 0.076 |
| 0.393411 | 0.074 |
| 0.388685 | 0.05 |
| 0.198158 | 0.019 |
| 0.136487 | 0.069 |
| 0.658569 | 0.012 |
| 0.252096 | 0.068 |
| 0.64291 | 0.142 |
| 0.0356956 | 0.264 |
| 0.793533 | 0.68 |
| 0.795351 | 0.161 |
| 0.491151 | 0.097 |
| 0.0226975 | 0.137 |
| 0.988198 | 0.204 |
| 0.289951 | 0.116 |
| 0.148607 | 0.102 |
| 0.0741219 | 0.179 |
| 0.0877585 | 0.386 |
| 0.0803597 | 0.05 |
| 0.560005 | 0.291 |
| 0.497162 | 0.068 |
| 0.0125631 | 0.11 |
| 0.0212754 | 0.057 |
| 0.124629 | 0.197 |
| 0.0080583 | 0.19 |
| 0.450942 | 0.06 |
| 0.246451 | 0.142 |
| 0.0847418 | 0.106 |
| 0.426286 | 0.031 |
| 0.119 | 0.14 |
| 0.0689015 | 0.06 |
| 0.0851591 | 0.589 |
| 0.142162 | 0.206 |
| 0.147683 | 0.523 |
| 0.0289584 | 0.05 |
| 0.0450513 | 0.114 |
| 0.155199 | 0.112 |
| 0.0728101 | 0.119 |
| 0.151233 | 0.15 |
| 0.0510655 | 0.183 |
| 0.211039 | 0.353 |
| 0.9968 | 0.827 |
| 0.160959 | 0.186 |
| 0.495123 | 0.442 |
| 0.98633 | 0.096 |
| 0.0350481 | 0.026 |
| 0.838341 | 0.037 |
| 0.95844 | 0.188 |
| 0.14382 | 0.079 |
| 0.0920523 | 0.36 |
| 0.33334 | 0.162 |
| 0.122164 | 0.065 |
| 0.00898889 | 0.064 |
| 0.249091 | 0.059 |
| 0.59045 | 0.119 |
| 0.431345 | 0.065 |
| 0.306179 | 0.695 |
| 0.185659 | 0.131 |
| 0.215561 | 0.061 |
| 0.975951 | 0.18 |
| 0.545534 | 0.124 |
| 0.411122 | 0.191 |
| 0.716015 | 0.153 |
| 0.0915619 | 0.106 |
| 0.256059 | 0.082 |
| 0.33067 | 0.133 |
| 0.998808 | 0.804 |
| 0.519916 | 0.039 |
| 0.163726 | 0.165 |
| 0.105254 | 0.412 |
| 0.121838 | 0.345 |
| 0.385674 | 0.18 |
| 0.0197494 | 0.244 |
| 0.290507 | 0.156 |
| 0.0882738 | 0.081 |
| 0.406341 | 0.006 |
| 0.331138 | 0.246 |
| 0.316128 | 0.105 |
| 0.378754 | 0.133 |
| 0.691504 | 0.458 |
| 0.505994 | 0.215 |
| 0.144624 | 0.159 |
| 0.288449 | 0.093 |
| 0.0614144 | 0.252 |
| 0.919089 | 0.06 |
| 0.193041 | 0.293 |
| 0.294627 | 0.027 |
| 0.0746155 | 0.057 |
| 0.491856 | 0.202 |
| 0.469099 | 0.13 |
| 0.05809 | 0.09 |
| 0.0282808 | 0.073 |
| 0.652899 | 0.097 |
| 0.139372 | 0.137 |
| 0.0422805 | 0.144 |
| 0.367609 | 0.342 |
| 0.0190779 | 0.041 |
| 0.1936 | 0.185 |
| 0.148379 | 0.134 |
| 0.100028 | 0.113 |
| 0.0435973 | 0.081 |
| 0.0762122 | 0.124 |
| 0.0247606 | 0.113 |
| 0.236412 | 0.19 |
| 0.0987665 | 0.067 |
| 0.0902571 | 0.097 |
| 0.0962512 | 0.038 |
| 0.00428952 | 0.07 |
| 0.0656497 | 0.075 |
| 0.00305447 | 0.023 |
| 0.0269453 | 0.158 |
| 0.00588332 | 0.04 |
| 0.0103038 | 0.155 |
| 0.374582 | 0.287 |
| 0.029594 | 0.053 |
| 0.158854 | 0.276 |
| 0.097693 | 0.415 |
| 0.0428243 | 0.14 |
| 0.00768589 | 0.097 |
| 0.0560589 | 0.087 |
| 0.0231935 | 0.213 |
| 0.0204415 | 0.151 |
| 0.116023 | 0.143 |
| 0.349524 | 0.552 |
| 0.208044 | 0.129 |
| 0.75722 | 0.123 |
| 0.212361 | 0.089 |
| 0.164271 | 0.16 |
| 0.25153 | 0.128 |
| 0.147431 | 0.208 |
| 0.0516695 | 0.059 |
| 0.0699926 | 0.072 |
| 0.0594754 | 0.448 |
| 0.195603 | 0.345 |
| 0.456818 | 0.159 |
| 0.032586 | 0.175 |
| 0.0423322 | 0.051 |
| 0.0335523 | 0.124 |
| 0.935046 | 0.25 |
| 0.988296 | 0.081 |
| 0.674173 | 0.151 |
| 0.950518 | 0.434 |
| 0.674799 | 0.155 |
| 0.095645 | 0.065 |
| 0.722024 | 0.38 |
| 0.813764 | 0.326 |
| 0.997254 | 0.558 |
| 0.531653 | 0.197 |
| 0.117316 | 0.098 |
| 0.0899062 | 0.191 |
| 0.0130087 | 0.058 |
| 0.328859 | 0.57 |
| 0.110804 | 0.094 |
| 0.963359 | 0.399 |
| 0.878038 | 0.288 |
| 0.999964 | 0.375 |
| 0.615835 | 0.098 |
| 0.987154 | 0.52 |
| 0.171877 | 0.07 |
| 0.116182 | 0.101 |
| 0.483035 | 0.17 |
| 0.900513 | 0.296 |
| 0.999752 | 0.411 |
| 0.923759 | 0.082 |
| 0.729231 | 0.192 |
| 0.249954 | 0.139 |
| 0.99999 | 0.69 |
| 0.999929 | 0.676 |
| 0.619004 | 0.096 |
| 0.996596 | 0.269 |
| 0.235779 | 0.114 |
| 0.0722696 | 0.225 |
| 0.999702 | 0.564 |
| 0.660512 | 0.3 |
| 0.896791 | 0.159 |
| 0.99606 | 0.728 |
| 1.0 | 0.849 |
| 0.998339 | 0.85 |
| 0.999285 | 0.698 |
| 0.997332 | 0.415 |
| 0.996545 | 0.542 |
| 0.681154 | 0.077 |
| 0.767111 | 0.158 |
| 0.533994 | 0.274 |
| 0.0964705 | 0.226 |
| 0.772539 | 0.112 |
| 0.497279 | 0.067 |
| 0.331921 | 0.344 |
| 0.207772 | 0.24 |
| 0.999989 | 0.515 |
| 0.999999 | 0.792 |
| 0.0084949 | 0.223 |
| 0.0243498 | 0.193 |
| 0.572885 | 0.16 |
| 0.0409478 | 0.178 |
| 0.45474 | 0.181 |
| 0.0188854 | 0.223 |
| 0.0525844 | 0.19 |
| 0.0132811 | 0.128 |
| 0.479361 | 0.535 |
| 0.637473 | 0.368 |
| 0.0527869 | 0.452 |
| 0.163816 | 0.326 |
| 0.0640716 | 0.15 |
| 0.343036 | 0.345 |
| 0.0185113 | 0.064 |
| 0.00364311 | 0.203 |
| 0.2127 | 0.306 |
| 0.989444 | 0.432 |
| 1.0 | 0.856 |
| 0.999984 | 0.896 |
| 0.628578 | 0.091 |
| 0.141169 | 0.266 |
| 0.0122061 | 0.155 |
| 0.62848 | 0.103 |
| 0.999998 | 0.148 |
| 0.102236 | 0.217 |
| 0.63452 | 0.027 |
| 0.0220537 | 0.045 |
| 0.0303041 | 0.082 |
| 0.0274181 | 0.146 |
| 0.25263 | 0.121 |
| 0.948207 | 0.12 |
| 0.751447 | 0.471 |
| 0.904977 | 0.134 |
| 0.0707763 | 0.056 |
| 0.299094 | 0.353 |
| 0.124299 | 0.008 |
| 0.57803 | 0.136 |
| 0.309117 | 0.083 |
| 0.28855 | 0.07 |
| 0.0758322 | 0.128 |
| 0.594897 | 0.279 |
| 0.0661176 | 0.035 |
| 0.125002 | 0.055 |
| 0.621458 | 0.038 |
| 0.136683 | 0.138 |
| 0.0742201 | 0.081 |
| 0.580785 | 0.411 |
| 0.751109 | 0.261 |
| 0.576531 | 0.218 |
| 0.0877255 | 0.068 |
| 0.0214506 | 0.199 |
| 0.531167 | 0.229 |
| 0.618271 | 0.13 |
| 0.0381046 | 0.23 |
| 0.392761 | 0.267 |
| 0.597793 | 0.232 |
| 0.346177 | 0.267 |
| 0.88466 | 0.048 |
| 0.998934 | 0.747 |
| 0.375236 | 0.059 |
| 0.524688 | 0.131 |
| 0.446545 | 0.07 |
| 0.944688 | 0.073 |
| 0.978563 | 0.129 |
| 0.98287 | 0.154 |
| 0.0589661 | 0.073 |
| 0.021768 | 0.094 |
| 0.0627515 | 0.059 |
| 0.0334076 | 0.209 |
| 0.0102006 | 0.135 |
| 0.0232065 | 0.071 |
| 0.013197 | 0.227 |
| 0.00556849 | 0.112 |
| 0.0312129 | 0.109 |
| 0.0468125 | 0.436 |
| 0.0226024 | 0.146 |
| 0.0169367 | 0.187 |
| 0.0410011 | 0.347 |
| 0.0392662 | 0.062 |
| 0.0854949 | 0.095 |
| 0.0090438 | 0.141 |
| 0.0171721 | 0.229 |
| 0.0357056 | 0.286 |
| 0.0377463 | 0.091 |
| 0.109047 | 0.126 |
| 0.0125514 | 0.129 |
| 0.0645226 | 0.287 |
| 0.110204 | 0.274 |
| 0.169824 | 0.102 |
| 0.104266 | 0.185 |
| 0.0192035 | 0.135 |
| 0.0344208 | 0.163 |
| 0.0108983 | 0.093 |
| 0.0455172 | 0.317 |
| 0.0158442 | 0.099 |
| 0.047303 | 0.045 |
| 0.182588 | 0.265 |
| 0.0143958 | 0.038 |
| 0.0119162 | 0.197 |
| 0.0264693 | 0.089 |
| 0.016213 | 0.081 |
| 0.0207121 | 0.206 |
| 0.0293214 | 0.035 |
| 0.0326069 | 0.056 |
| 0.0429485 | 0.054 |
| 0.0158706 | 0.093 |
| 0.0624386 | 0.032 |
| 0.033196 | 0.036 |
| 0.0365961 | 0.126 |
| 0.25132 | 0.039 |
| 0.163036 | 0.066 |
| 0.0970382 | 0.087 |
| 0.130057 | 0.222 |
| 0.953108 | 0.286 |
| 0.0959335 | 0.068 |
| 0.087713 | 0.272 |
| 0.0685606 | 0.187 |
| 0.640539 | 0.396 |
| 0.0333903 | 0.271 |
| 0.193811 | 0.442 |
| 0.0650027 | 0.041 |
| 0.183963 | 0.037 |
| 0.307129 | 0.123 |
| 0.511869 | 0.205 |
| 0.191881 | 0.127 |
| 0.0119746 | 0.059 |
| 0.111044 | 0.028 |
| 0.302262 | 0.131 |
| 0.068113 | 0.073 |
| 0.0172277 | 0.072 |
| 0.0463475 | 0.086 |
| 0.366888 | 0.203 |
| 0.0586054 | 0.09 |
| 0.0394279 | 0.078 |
| 0.0212619 | 0.032 |
| 0.209226 | 0.238 |
| 0.444449 | 0.097 |
| 0.350746 | 0.103 |
| 0.193665 | 0.057 |
| 0.221569 | 0.099 |
| 0.01046 | 0.118 |
| 0.093282 | 0.129 |
| 0.0864668 | 0.169 |
| 0.1017 | 0.139 |
| 0.1356 | 0.14 |
| 0.0197721 | 0.119 |
| 0.00765144 | 0.081 |
| 0.462388 | 0.248 |
| 0.0251913 | 0.152 |
| 0.0907928 | 0.09 |
| 0.0170146 | 0.094 |
| 0.0961076 | 0.128 |
| 0.110348 | 0.263 |
| 0.0187208 | 0.158 |
| 0.0844677 | 0.15 |
| 0.0246886 | 0.148 |
| 0.0693113 | 0.12 |
| 0.0790785 | 0.125 |
| 0.00828256 | 0.139 |
| 0.0621558 | 0.106 |
| 0.0653101 | 0.311 |
| 0.00861881 | 0.198 |
| 0.178273 | 0.204 |
| 0.0438949 | 0.132 |
| 0.0419443 | 0.026 |
| 0.0963196 | 0.114 |
| 0.0121006 | 0.08 |
| 0.0666166 | 0.116 |
| 0.00742865 | 0.386 |
| 0.00690434 | 0.141 |
| 0.0212081 | 0.156 |
| 0.0516271 | 0.09 |
| 0.0242191 | 0.088 |
| 0.145565 | 0.371 |
| 0.170242 | 0.155 |
| 0.157528 | 0.037 |
| 0.448124 | 0.498 |
| 0.0182543 | 0.259 |
| 0.295222 | 0.264 |
| 0.99918 | 0.747 |
| 0.458214 | 0.063 |
| 0.193428 | 0.111 |
| 0.204762 | 0.052 |
| 0.923902 | 0.385 |
| 0.084815 | 0.171 |
| 0.39246 | 0.561 |
| 0.728265 | 0.124 |
| 0.417262 | 0.208 |
| 0.3406 | 0.128 |
| 0.810233 | 0.55 |
| 0.324857 | 0.031 |
| 0.086525 | 0.049 |
| 0.736122 | 0.128 |
| 0.0908533 | 0.15 |
| 0.433534 | 0.109 |
| 0.532516 | 0.459 |
| 0.986874 | 0.181 |
| 0.240312 | 0.337 |
| 0.199518 | 0.075 |
| 0.17959 | 0.252 |
| 0.0424938 | 0.055 |
| 0.132656 | 0.141 |
| 0.118333 | 0.123 |
| 0.496088 | 0.231 |
| 0.477072 | 0.204 |
| 0.440385 | 0.124 |
| 0.563571 | 0.108 |
| 0.011366 | 0.218 |
| 0.059063 | 0.197 |
| 0.0276554 | 0.09 |
| 0.0250466 | 0.221 |
| 0.187957 | 0.28 |
| 0.0830897 | 0.041 |
| 0.0301601 | 0.037 |
| 0.0105289 | 0.09 |
| 0.0163828 | 0.146 |
| 0.0644174 | 0.28 |
| 0.126787 | 0.466 |
| 0.0224719 | 0.147 |
| 0.00490462 | 0.17 |
| 0.112877 | 0.146 |
| 0.0767865 | 0.437 |
| 0.0834902 | 0.084 |
| 0.171273 | 0.178 |
| 0.0160967 | 0.053 |
| 0.0566357 | 0.112 |
| 0.0836146 | 0.084 |
| 0.0846404 | 0.112 |
| 0.0106217 | 0.151 |
| 0.0145284 | 0.206 |
| 0.0123423 | 0.119 |
| 0.0407996 | 0.199 |
| 0.151856 | 0.241 |
| 0.223442 | 0.412 |
| 0.364725 | 0.039 |
| 0.110765 | 0.407 |
| 0.0461888 | 0.248 |
| 0.0171033 | 0.326 |
| 0.0714977 | 0.164 |
| 0.378915 | 0.045 |
| 0.0755547 | 0.112 |
| 0.0468166 | 0.052 |
| 0.0645643 | 0.097 |
| 0.335013 | 0.181 |
| 0.15664 | 0.302 |
| 0.0446142 | 0.159 |
| 0.0661056 | 0.087 |
| 0.0386835 | 0.205 |
| 0.020888 | 0.067 |
| 0.243813 | 0.235 |
| 0.0312266 | 0.085 |
| 0.116142 | 0.25 |
| 0.168989 | 0.151 |
| 0.250176 | 0.086 |
| 0.00775243 | 0.121 |
| 0.0771182 | 0.061 |
| 0.798824 | 0.118 |
| 0.0963236 | 0.125 |
| 0.0614317 | 0.073 |
| 0.724372 | 0.213 |
| 0.453196 | 0.376 |
| 0.0589736 | 0.219 |
| 0.0557552 | 0.029 |
| 0.455322 | 0.222 |
| 0.0670983 | 0.033 |
| 0.263397 | 0.174 |
| 0.0924782 | 0.16 |
| 0.078766 | 0.066 |
| 0.0260028 | 0.086 |
| 0.0081193 | 0.079 |
| 0.0520851 | 0.061 |
| 0.0139322 | 0.011 |
| 0.0223479 | 0.214 |
| 0.0536557 | 0.119 |
| 0.335189 | 0.128 |
| 0.912935 | 0.408 |
| 0.367767 | 0.369 |
| 0.436079 | 0.014 |
| 0.796443 | 0.245 |
| 0.113954 | 0.036 |
| 0.340996 | 0.082 |
| 0.896164 | 0.076 |
| 0.0789581 | 0.114 |
| 0.533718 | 0.236 |
| 0.861754 | 0.747 |
| 0.110051 | 0.124 |
| 0.484344 | 0.042 |
| 0.988302 | 0.481 |
| 1.0 | 0.591 |
| 0.996018 | 0.247 |
| 0.0361723 | 0.086 |
| 0.356055 | 0.259 |
| 0.0182137 | 0.096 |
| 0.118938 | 0.12 |
| 0.0400954 | 0.092 |
| 0.999512 | 0.309 |
| 0.620379 | 0.068 |
| 0.765736 | 0.096 |
| 0.792556 | 0.014 |